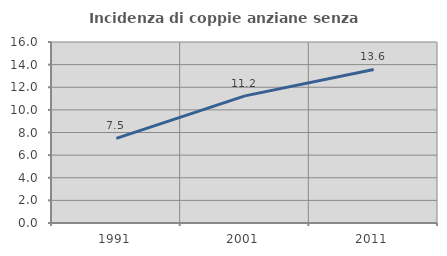
| Category | Incidenza di coppie anziane senza figli  |
|---|---|
| 1991.0 | 7.484 |
| 2001.0 | 11.237 |
| 2011.0 | 13.572 |